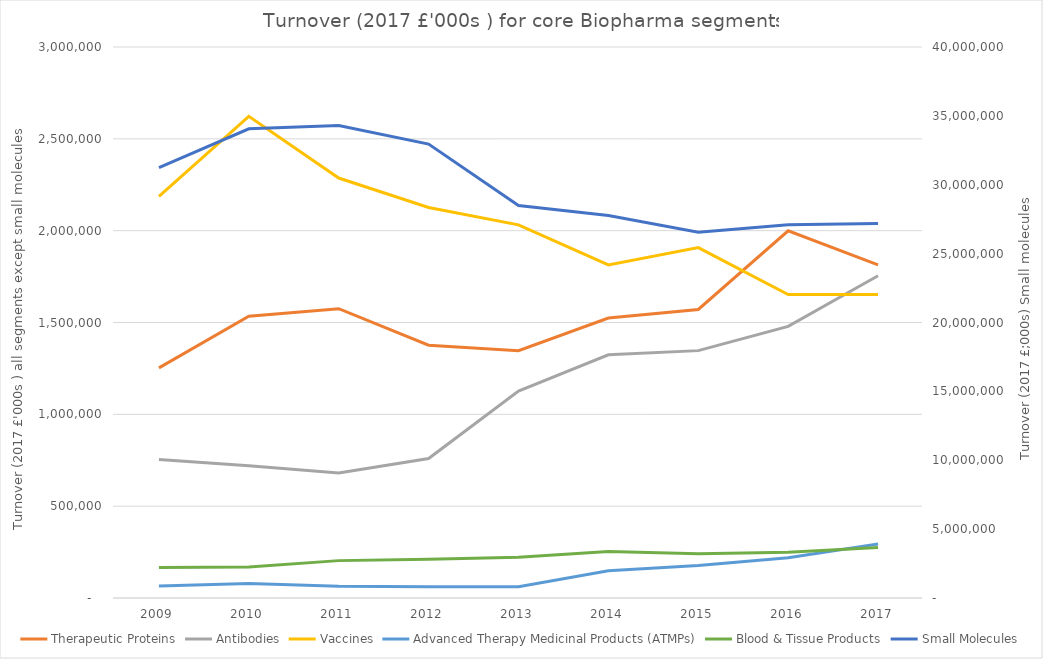
| Category | Therapeutic Proteins | Antibodies | Vaccines | Advanced Therapy Medicinal Products (ATMPs) | Blood & Tissue Products |
|---|---|---|---|---|---|
| 2009 | 1252906 | 754662 | 2187332 | 64896 | 165553 |
| 2010 | 1534552 | 719640 | 2622681 | 79431 | 169423 |
| 2011 | 1575191 | 680673 | 2286636 | 64455 | 203496 |
| 2012 | 1376323 | 759568 | 2126463 | 61482 | 211395 |
| 2013 | 1346196 | 1126288 | 2031603 | 61213 | 221649 |
| 2014 | 1524390 | 1323936 | 1813754 | 147862 | 252624 |
| 2015 | 1571146 | 1346849 | 1907761 | 176922 | 240539 |
| 2016 | 1999148 | 1478620 | 1651842 | 219119 | 249512 |
| 2017 | 1814231 | 1754444 | 1651813 | 293458 | 275531 |